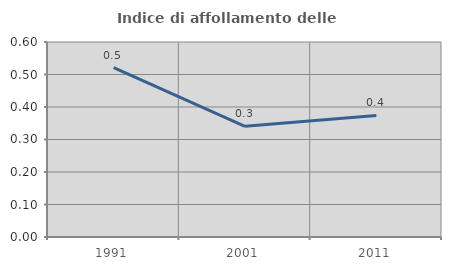
| Category | Indice di affollamento delle abitazioni  |
|---|---|
| 1991.0 | 0.521 |
| 2001.0 | 0.341 |
| 2011.0 | 0.374 |